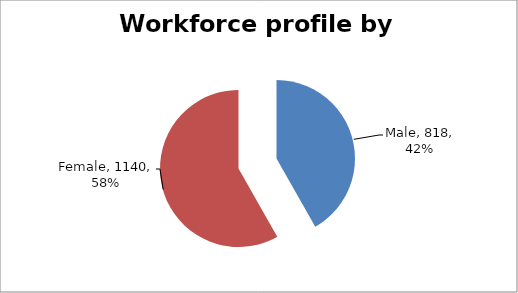
| Category | Series 0 |
|---|---|
| Male | 818 |
| Female | 1140 |